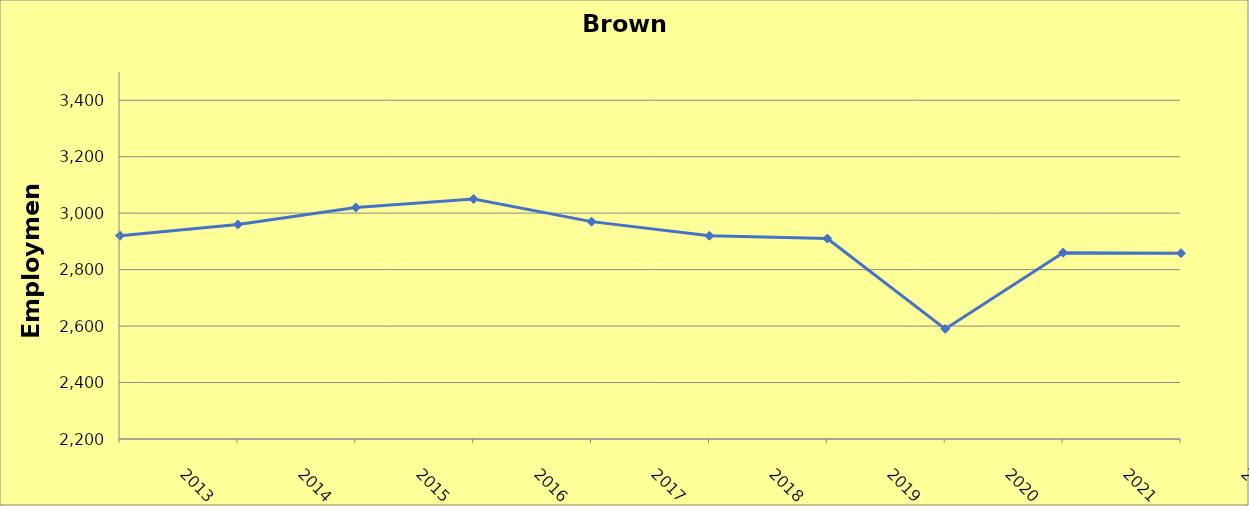
| Category | Brown County |
|---|---|
| 2013.0 | 2920 |
| 2014.0 | 2960 |
| 2015.0 | 3020 |
| 2016.0 | 3050 |
| 2017.0 | 2970 |
| 2018.0 | 2920 |
| 2019.0 | 2910 |
| 2020.0 | 2590 |
| 2021.0 | 2860 |
| 2022.0 | 2858 |